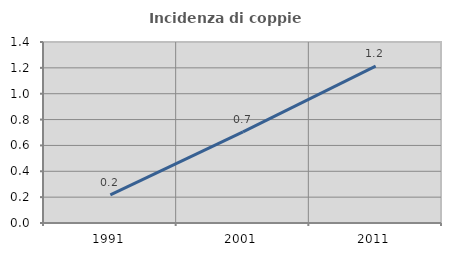
| Category | Incidenza di coppie miste |
|---|---|
| 1991.0 | 0.217 |
| 2001.0 | 0.705 |
| 2011.0 | 1.214 |